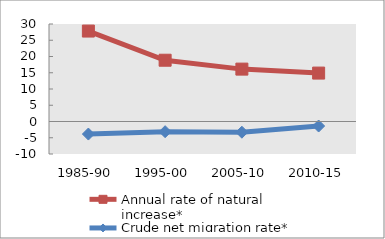
| Category | Annual rate of natural increase* | Crude net migration rate* |
|---|---|---|
| 1985-90 | 27.828 | -3.861 |
| 1995-00 | 18.852 | -3.133 |
| 2005-10 | 16.117 | -3.296 |
| 2010-15 | 14.897 | -1.392 |